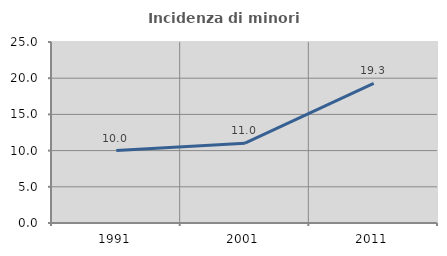
| Category | Incidenza di minori stranieri |
|---|---|
| 1991.0 | 10 |
| 2001.0 | 11.022 |
| 2011.0 | 19.274 |